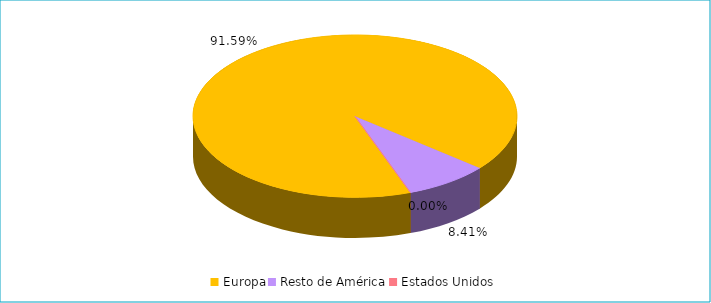
| Category | Series 0 |
|---|---|
| Europa | 0.916 |
| Resto de América | 0.084 |
| Estados Unidos | 0 |